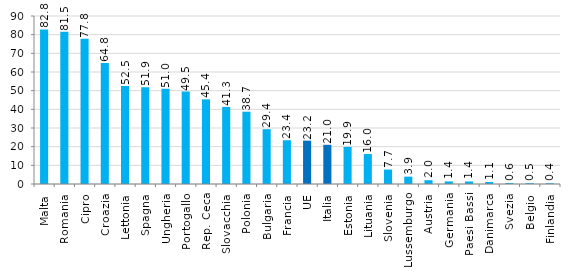
| Category | Series 0 |
|---|---|
| Malta | 82.769 |
| Romania | 81.497 |
| Cipro | 77.802 |
| Croazia | 64.78 |
| Lettonia | 52.535 |
| Spagna | 51.868 |
| Ungheria | 50.99 |
| Portogallo | 49.507 |
| Rep. Ceca | 45.355 |
| Slovacchia | 41.316 |
| Polonia | 38.73 |
| Bulgaria | 29.361 |
| Francia | 23.422 |
| UE | 23.226 |
| Italia | 21.005 |
| Estonia | 19.884 |
| Lituania | 16.047 |
| Slovenia | 7.737 |
| Lussemburgo | 3.937 |
| Austria | 2.033 |
| Germania | 1.374 |
| Paesi Bassi | 1.352 |
| Danimarca | 1.088 |
| Svezia | 0.551 |
| Belgio | 0.457 |
| Finlandia | 0.401 |